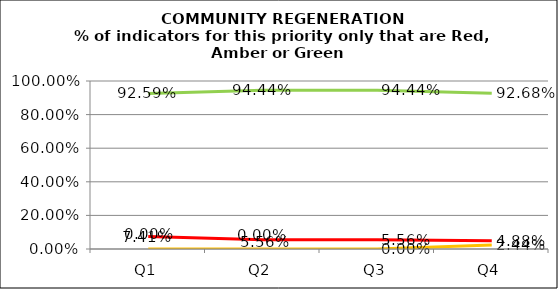
| Category | Green | Amber | Red |
|---|---|---|---|
| Q1 | 0.926 | 0 | 0.074 |
| Q2 | 0.944 | 0 | 0.056 |
| Q3 | 0.944 | 0 | 0.056 |
| Q4 | 0.927 | 0.024 | 0.049 |